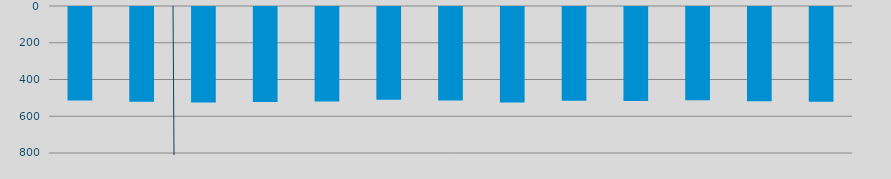
| Category | Energía a bajar | Energía a subir |
|---|---|---|
| N | 509.389 |  |
| D | 515.349 |  |
| E | 520.032 |  |
| F | 516.897 |  |
| M | 513.61 |  |
| A | 504.985 |  |
| M | 508.805 |  |
| J | 519.464 |  |
| J | 510.745 |  |
| A | 512.124 |  |
| S | 507.342 |  |
| O | 513.588 |  |
| N | 515.549 |  |